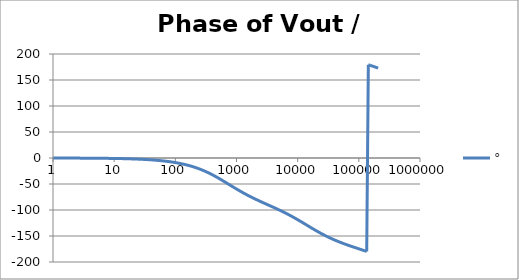
| Category | ° |
|---|---|
| 1.0 | -0.088 |
| 1.0634378492473788 | -0.094 |
| 1.1309000592118907 | -0.1 |
| 1.2026419266820265 | -0.106 |
| 1.278934943925458 | -0.113 |
| 1.3600678260954062 | -0.12 |
| 1.4463476038134566 | -0.128 |
| 1.5381007850634825 | -0.136 |
| 1.6356745907936145 | -0.145 |
| 1.739438268902148 | -0.154 |
| 1.849784491579884 | -0.164 |
| 1.967130841296868 | -0.174 |
| 2.091921391056928 | -0.185 |
| 2.2246283849001642 | -0.197 |
| 2.365754025012901 | -0.209 |
| 2.5158323722080485 | -0.222 |
| 2.6754313669678584 | -0.237 |
| 2.8451549786972743 | -0.252 |
| 3.025645491321301 | -0.268 |
| 3.2175859338757533 | -0.285 |
| 3.42170266528945 | -0.303 |
| 3.6387681231394358 | -0.322 |
| 3.8696037467813236 | -0.342 |
| 4.115083085916729 | -0.364 |
| 4.376135106361553 | -0.387 |
| 4.653747705525078 | -0.412 |
| 4.948971450903514 | -0.438 |
| 5.262923555735513 | -0.465 |
| 5.596792106864742 | -0.495 |
| 5.951840560808945 | -0.526 |
| 6.329412525049976 | -0.56 |
| 6.730936842638569 | -0.595 |
| 7.157932999355504 | -0.633 |
| 7.612016873891456 | -0.673 |
| 8.094906852805886 | -0.716 |
| 8.608430333405762 | -0.761 |
| 9.154530639152917 | -0.809 |
| 9.735274373770007 | -0.861 |
| 10.352859241875105 | -0.915 |
| 11.009622365740512 | -0.973 |
| 11.708049129648925 | -1.035 |
| 12.4507825853165 | -1.101 |
| 13.240633453975693 | -1.171 |
| 14.080590762968805 | -1.245 |
| 14.973833157104059 | -1.324 |
| 15.923740927579823 | -1.408 |
| 16.93390880399795 | -1.497 |
| 18.008159557874837 | -1.592 |
| 19.150558469130036 | -1.693 |
| 20.365428710297824 | -1.8 |
| 21.65736770667993 | -1.915 |
| 23.031264534351347 | -2.036 |
| 24.492318421858034 | -2.165 |
| 26.046058425622668 | -2.302 |
| 27.698364353515743 | -2.448 |
| 29.45548901577305 | -2.603 |
| 31.32408188746347 | -2.768 |
| 33.311214272052936 | -2.943 |
| 35.42440606129053 | -3.13 |
| 37.67165419268462 | -3.328 |
| 40.06146291225952 | -3.539 |
| 42.60287595711691 | -3.763 |
| 45.30551077958928 | -4.001 |
| 48.17959494250036 | -4.254 |
| 51.23600482326248 | -4.522 |
| 54.486306773278585 | -4.808 |
| 57.94280088840825 | -5.112 |
| 61.61856755613799 | -5.435 |
| 65.52751695560372 | -5.777 |
| 69.68444169778837 | -6.141 |
| 74.10507280510043 | -6.528 |
| 78.80613924217637 | -6.939 |
| 83.8054312231895 | -7.375 |
| 89.12186753523771 | -7.838 |
| 94.77556713258299 | -8.329 |
| 100.78792527267464 | -8.85 |
| 107.18169448207877 | -9.403 |
| 113.98107065871142 | -9.989 |
| 121.21178463621371 | -10.611 |
| 128.90119955697148 | -11.269 |
| 137.07841442227294 | -11.966 |
| 145.77437421146283 | -12.704 |
| 155.02198698682062 | -13.485 |
| 164.85624842731968 | -14.311 |
| 175.3143742625403 | -15.183 |
| 186.43594110790573 | -16.103 |
| 198.26303623420247 | -17.074 |
| 210.84041683815525 | -18.096 |
| 224.21567941678887 | -19.173 |
| 238.43943988652958 | -20.304 |
| 253.56552512868072 | -21.492 |
| 269.65117668612646 | -22.737 |
| 286.75726738211927 | -24.039 |
| 304.9485316808965 | -25.4 |
| 324.2938106618788 | -26.818 |
| 344.8663125345048 | -28.294 |
| 366.7438896795682 | -29.827 |
| 390.00933326545766 | -31.413 |
| 414.7506865542229 | -33.052 |
| 441.06157808309626 | -34.741 |
| 469.0415759823428 | -36.475 |
| 498.7965647702637 | -38.252 |
| 530.4391460512702 | -40.066 |
| 564.089064633379 | -41.912 |
| 599.8736616776864 | -43.785 |
| 637.9283565946681 | -45.679 |
| 678.3971595109495 | -47.588 |
| 721.4332162458546 | -49.506 |
| 767.1993878601115 | -51.427 |
| 815.868866969862 | -53.345 |
| 867.6258331583267 | -55.255 |
| 922.6661499653554 | -57.15 |
| 981.1981060925172 | -59.028 |
| 1043.443203628628 | -60.882 |
| 1109.6369962786232 | -62.711 |
| 1180.0299807678607 | -64.51 |
| 1254.8885447951977 | -66.279 |
| 1334.4959751221782 | -68.014 |
| 1419.1535296132129 | -69.717 |
| 1509.1815772837017 | -71.385 |
| 1604.9208106703452 | -73.02 |
| 1706.7335351116335 | -74.622 |
| 1815.0050398174897 | -76.193 |
| 1930.1450559166665 | -77.735 |
| 2052.58930699948 | -79.249 |
| 2182.801158023697 | -80.738 |
| 2321.2733688234066 | -82.206 |
| 2468.5299588567814 | -83.654 |
| 2625.128190249376 | -85.087 |
| 2791.6606766374607 | -86.507 |
| 2968.757625791824 | -87.918 |
| 3157.08922450881 | -89.324 |
| 3357.3681747937244 | -90.727 |
| 3570.352390934236 | -92.133 |
| 3796.8478676703417 | -93.544 |
| 4037.7117303148448 | -94.963 |
| 4293.8554783669315 | -96.395 |
| 4566.248434893605 | -97.842 |
| 4855.9214147324665 | -99.308 |
| 5163.970625397384 | -100.796 |
| 5491.561815449236 | -102.308 |
| 5839.934686030357 | -103.846 |
| 6210.40758225729 | -105.414 |
| 6604.382482225307 | -107.012 |
| 7023.350302504747 | -108.642 |
| 7468.896540206577 | -110.304 |
| 7942.707272968458 | -111.999 |
| 8446.575539567106 | -113.726 |
| 8982.408125302747 | -115.485 |
| 9552.232777834151 | -117.273 |
| 10158.205880770249 | -119.089 |
| 10802.620614058389 | -120.929 |
| 11487.915632049675 | -122.79 |
| 12216.684292082227 | -124.667 |
| 12991.684468506162 | -126.557 |
| 13815.848989288772 | -128.454 |
| 14692.296734695852 | -130.353 |
| 15624.344440049217 | -132.248 |
| 16615.519247226184 | -134.133 |
| 17669.572052398642 | -136.003 |
| 18790.49170052441 | -137.853 |
| 19982.5200803064 | -139.678 |
| 21250.168176743602 | -141.472 |
| 22598.233142021272 | -143.233 |
| 24031.816449341983 | -144.955 |
| 25556.34319839602 | -146.638 |
| 27177.582645530147 | -148.278 |
| 28901.67003630542 | -149.875 |
| 30735.129823066054 | -151.428 |
| 32684.900355380338 | -152.935 |
| 34758.3601367905 | -154.4 |
| 36963.35574723439 | -155.821 |
| 39308.23153680468 | -157.201 |
| 41801.861203217486 | -158.542 |
| 44453.68137248706 | -159.846 |
| 47273.727309885995 | -161.115 |
| 50272.670896332245 | -162.352 |
| 53461.86101391677 | -163.558 |
| 56853.36649340195 | -164.738 |
| 60460.02178621637 | -165.892 |
| 64295.47553378361 | -167.025 |
| 68374.24221798431 | -168.136 |
| 72711.75708821259 | -169.23 |
| 77324.43457288652 | -170.308 |
| 82229.73039646025 | -171.373 |
| 87446.2076370035 | -172.425 |
| 92993.60697433475 | -173.468 |
| 98892.92139454243 | -174.502 |
| 105166.47563360249 | -175.531 |
| 111838.01066072512 | -176.556 |
| 118932.77352114675 | -177.579 |
| 126477.61287835392 | -178.603 |
| 134501.0806172993 | -179.629 |
| 143033.53989310883 | 179.339 |
| 152107.28003416685 | 178.3 |
| 161756.63873440344 | 177.251 |
| 172018.1319971993 | 176.189 |
| 182930.592322653 | 175.112 |
| 194535.31566115122 | 174.018 |
| 206876.217689355 | 172.902 |